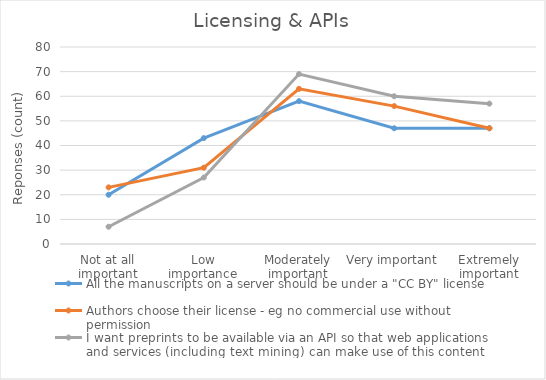
| Category | All the manuscripts on a server should be under a "CC BY" license | Authors choose their license - eg no commercial use without permission | I want preprints to be available via an API so that web applications and services (including text mining) can make use of this content |
|---|---|---|---|
| Not at all important | 20 | 23 | 7 |
| Low importance | 43 | 31 | 27 |
| Moderately important | 58 | 63 | 69 |
| Very important | 47 | 56 | 60 |
| Extremely important | 47 | 47 | 57 |